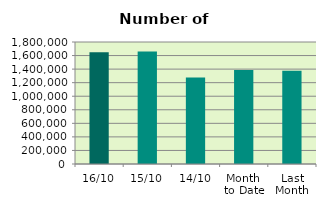
| Category | Series 0 |
|---|---|
| 16/10 | 1647920 |
| 15/10 | 1659450 |
| 14/10 | 1274788 |
| Month 
to Date | 1386919 |
| Last
Month | 1376245.636 |